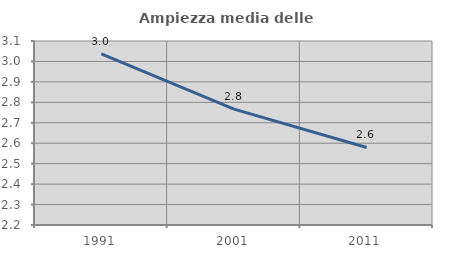
| Category | Ampiezza media delle famiglie |
|---|---|
| 1991.0 | 3.036 |
| 2001.0 | 2.767 |
| 2011.0 | 2.579 |